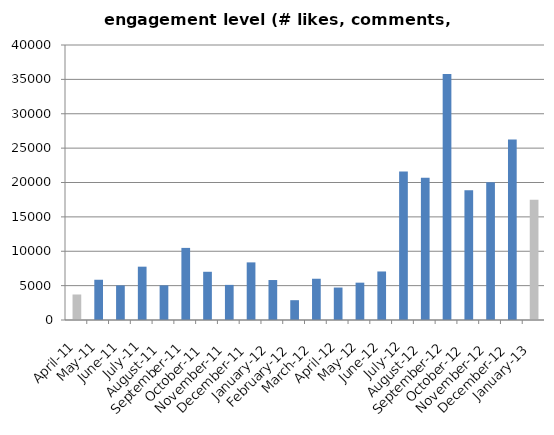
| Category | engagement |
|---|---|
| 2011-04-01 | 3710 |
| 2011-05-02 | 5854 |
| 2011-06-02 | 5034 |
| 2011-07-02 | 7756 |
| 2011-08-02 | 5039 |
| 2011-09-02 | 10488 |
| 2011-10-02 | 7014 |
| 2011-11-02 | 5107 |
| 2011-12-02 | 8381 |
| 2012-01-02 | 5814 |
| 2012-02-02 | 2882 |
| 2012-03-02 | 6001 |
| 2012-04-02 | 4720 |
| 2012-05-02 | 5430 |
| 2012-06-02 | 7058 |
| 2012-07-02 | 21588 |
| 2012-08-02 | 20698 |
| 2012-09-02 | 35764 |
| 2012-10-02 | 18877 |
| 2012-11-02 | 20053 |
| 2012-12-02 | 26237 |
| 2013-01-02 | 17501 |